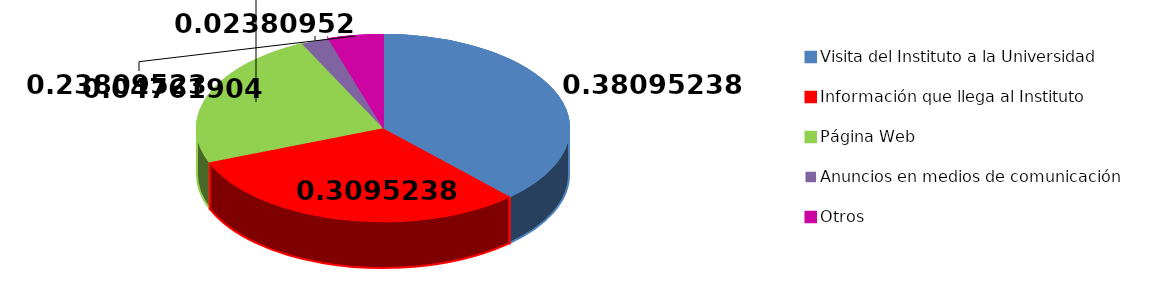
| Category | Series 0 |
|---|---|
| Visita del Instituto a la Universidad | 16 |
| Información que llega al Instituto | 13 |
| Página Web | 10 |
| Anuncios en medios de comunicación | 1 |
| Otros | 2 |